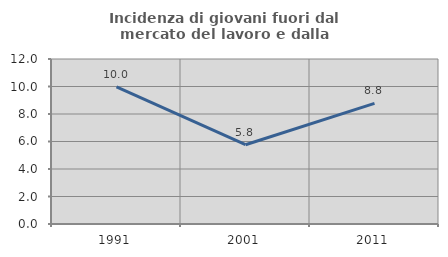
| Category | Incidenza di giovani fuori dal mercato del lavoro e dalla formazione  |
|---|---|
| 1991.0 | 9.98 |
| 2001.0 | 5.765 |
| 2011.0 | 8.768 |